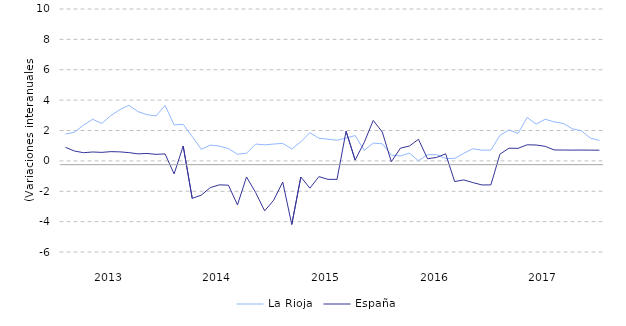
| Category | La Rioja | España |
|---|---|---|
| nan | 1.764 | 0.89 |
| nan | 1.893 | 0.646 |
| nan | 2.361 | 0.537 |
| nan | 2.739 | 0.586 |
| nan | 2.461 | 0.559 |
| 2013.0 | 2.976 | 0.608 |
| nan | 3.378 | 0.593 |
| nan | 3.658 | 0.545 |
| nan | 3.245 | 0.461 |
| nan | 3.042 | 0.489 |
| nan | 2.96 | 0.429 |
| nan | 3.651 | 0.461 |
| nan | 2.367 | -0.859 |
| nan | 2.404 | 0.981 |
| nan | 1.597 | -2.469 |
| nan | 0.758 | -2.255 |
| nan | 1.036 | -1.758 |
| 2014.0 | 0.978 | -1.579 |
| nan | 0.812 | -1.602 |
| nan | 0.439 | -2.898 |
| nan | 0.503 | -1.059 |
| nan | 1.107 | -2.075 |
| nan | 1.057 | -3.292 |
| nan | 1.108 | -2.589 |
| nan | 1.15 | -1.394 |
| nan | 0.782 | -4.188 |
| nan | 1.256 | -1.063 |
| nan | 1.858 | -1.796 |
| nan | 1.492 | -1.037 |
| 2015.0 | 1.428 | -1.217 |
| nan | 1.36 | -1.218 |
| nan | 1.499 | 1.955 |
| nan | 1.668 | 0.052 |
| nan | 0.692 | 1.211 |
| nan | 1.169 | 2.661 |
| nan | 1.123 | 1.904 |
| nan | 0.378 | -0.058 |
| nan | 0.323 | 0.836 |
| nan | 0.509 | 0.977 |
| nan | 0.008 | 1.419 |
| nan | 0.409 | 0.141 |
| 2016.0 | 0.409 | 0.227 |
| nan | 0.159 | 0.466 |
| nan | 0.163 | -1.362 |
| nan | 0.5 | -1.253 |
| nan | 0.799 | -1.428 |
| nan | 0.699 | -1.583 |
| nan | 0.71 | -1.583 |
| nan | 1.681 | 0.442 |
| nan | 2.041 | 0.836 |
| nan | 1.804 | 0.825 |
| nan | 2.861 | 1.058 |
| nan | 2.423 | 1.046 |
| 2017.0 | 2.74 | 0.956 |
| nan | 2.568 | 0.718 |
| nan | 2.462 | 0.715 |
| nan | 2.115 | 0.708 |
| nan | 1.984 | 0.712 |
| nan | 1.494 | 0.706 |
| nan | 1.346 | 0.703 |